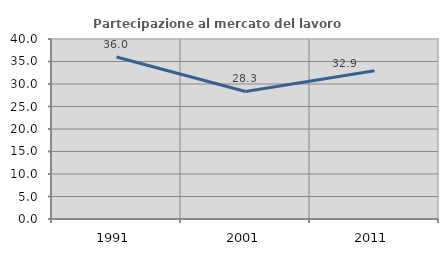
| Category | Partecipazione al mercato del lavoro  femminile |
|---|---|
| 1991.0 | 36 |
| 2001.0 | 28.335 |
| 2011.0 | 32.934 |